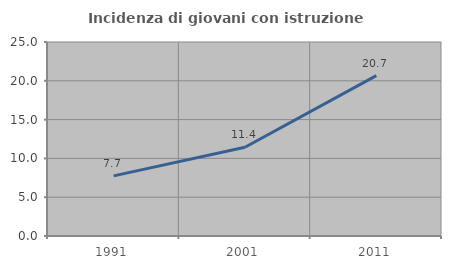
| Category | Incidenza di giovani con istruzione universitaria |
|---|---|
| 1991.0 | 7.746 |
| 2001.0 | 11.438 |
| 2011.0 | 20.661 |